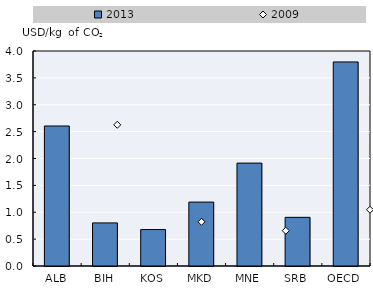
| Category | 2013 |
|---|---|
| ALB | 2.605 |
| BIH | 0.802 |
| KOS | 0.678 |
| MKD | 1.189 |
| MNE | 1.914 |
| SRB | 0.905 |
| OECD | 3.796 |